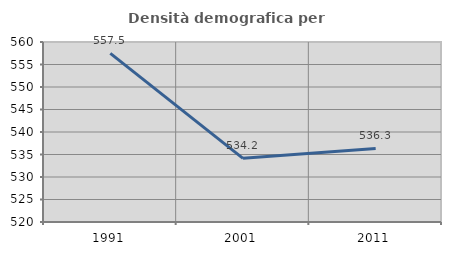
| Category | Densità demografica |
|---|---|
| 1991.0 | 557.471 |
| 2001.0 | 534.151 |
| 2011.0 | 536.348 |